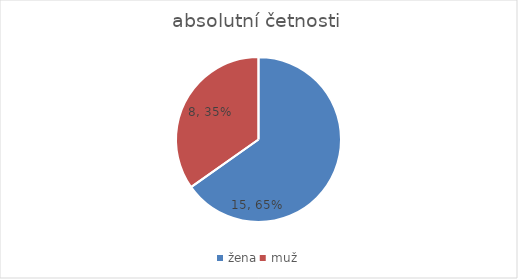
| Category | absolutní četnosti |
|---|---|
| žena | 15 |
| muž | 8 |